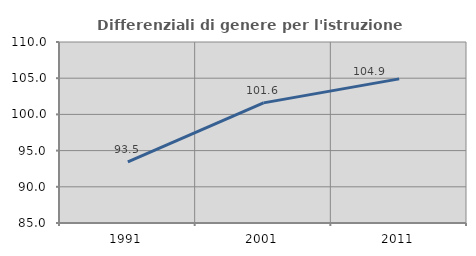
| Category | Differenziali di genere per l'istruzione superiore |
|---|---|
| 1991.0 | 93.454 |
| 2001.0 | 101.589 |
| 2011.0 | 104.908 |